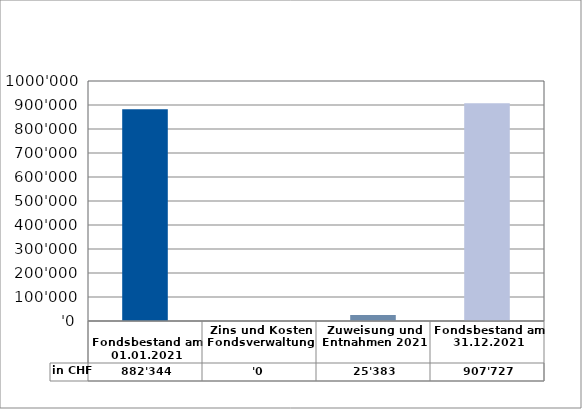
| Category | in CHF |
|---|---|
| 
Fondsbestand am 01.01.2021

 | 882344 |
| Zins und Kosten Fondsverwaltung | 0 |
| Zuweisung und Entnahmen 2021 | 25382.95 |
| Fondsbestand am 31.12.2021 | 907726.95 |